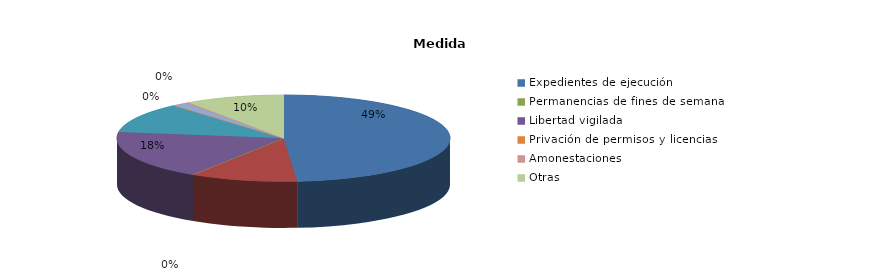
| Category | Series 0 |
|---|---|
| Expedientes de ejecución | 1194 |
| Internamientos | 256 |
| Permanencias de fines de semana | 0 |
| Libertad vigilada | 446 |
| Prestaciones en beneficio de la comunidad | 276 |
| Privación de permisos y licencias | 1 |
| Convivencia Familiar Educativa | 35 |
| Amonestaciones | 8 |
| Otras | 236 |